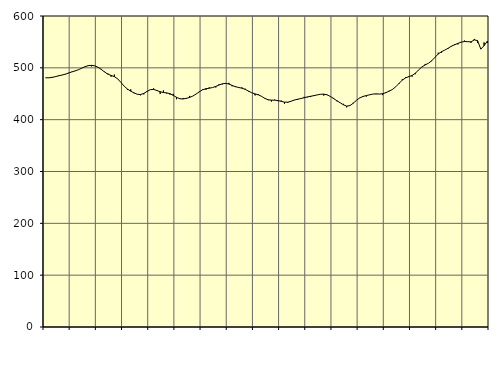
| Category | Piggar | Series 1 |
|---|---|---|
| nan | 480.3 | 480.8 |
| 87.0 | 480.5 | 480.75 |
| 87.0 | 482.5 | 481.49 |
| 87.0 | 482.3 | 483.02 |
| nan | 485.6 | 484.6 |
| 88.0 | 485.9 | 486.1 |
| 88.0 | 487.1 | 487.77 |
| 88.0 | 490.5 | 489.87 |
| nan | 492.6 | 492.14 |
| 89.0 | 493.8 | 494.07 |
| 89.0 | 496.4 | 496.28 |
| 89.0 | 499 | 499.15 |
| nan | 502.5 | 502.1 |
| 90.0 | 503.6 | 504.16 |
| 90.0 | 502.8 | 504.78 |
| 90.0 | 504.2 | 503.87 |
| nan | 501.3 | 501.18 |
| 91.0 | 497.9 | 496.98 |
| 91.0 | 492.7 | 492.05 |
| 91.0 | 489.1 | 487.88 |
| nan | 482.9 | 485.37 |
| 92.0 | 486.9 | 483.03 |
| 92.0 | 478.5 | 478.78 |
| 92.0 | 472 | 471.93 |
| nan | 464.7 | 464.64 |
| 93.0 | 457.4 | 459.09 |
| 93.0 | 458.4 | 455 |
| 93.0 | 451 | 451.74 |
| nan | 449.1 | 449.03 |
| 94.0 | 447 | 448.38 |
| 94.0 | 448.8 | 450.68 |
| 94.0 | 455.3 | 454.5 |
| nan | 457.6 | 457.9 |
| 95.0 | 460.3 | 458.4 |
| 95.0 | 457 | 456.24 |
| 95.0 | 449.7 | 453.9 |
| nan | 456.4 | 452.33 |
| 96.0 | 450.5 | 451.67 |
| 96.0 | 448.2 | 450.16 |
| 96.0 | 449.8 | 446.8 |
| nan | 439.4 | 443.11 |
| 97.0 | 441.3 | 440.37 |
| 97.0 | 441.7 | 439.96 |
| 97.0 | 440.1 | 441.18 |
| nan | 445.8 | 442.87 |
| 98.0 | 445.6 | 445.59 |
| 98.0 | 449.7 | 449.51 |
| 98.0 | 455.1 | 453.93 |
| nan | 458.7 | 457.76 |
| 99.0 | 457.6 | 459.71 |
| 99.0 | 462.3 | 460.67 |
| 99.0 | 462 | 461.98 |
| nan | 462.1 | 464.2 |
| 0.0 | 468.2 | 466.81 |
| 0.0 | 468 | 469.2 |
| 0.0 | 469.1 | 470.01 |
| nan | 471 | 468.73 |
| 1.0 | 464.3 | 466.13 |
| 1.0 | 464.6 | 463.54 |
| 1.0 | 462.7 | 462.09 |
| nan | 462.2 | 460.71 |
| 2.0 | 459.7 | 458.42 |
| 2.0 | 454.4 | 455.12 |
| 2.0 | 451.9 | 451.87 |
| nan | 446.8 | 449.71 |
| 3.0 | 449.2 | 447.92 |
| 3.0 | 445.3 | 444.98 |
| 3.0 | 440.4 | 441.01 |
| nan | 437.6 | 438.41 |
| 4.0 | 435 | 437.69 |
| 4.0 | 438.6 | 437.55 |
| 4.0 | 435.7 | 436.87 |
| nan | 436.8 | 435.29 |
| 5.0 | 430.8 | 433.82 |
| 5.0 | 432.7 | 433.72 |
| 5.0 | 435.3 | 435.51 |
| nan | 438.2 | 437.81 |
| 6.0 | 438.1 | 439.36 |
| 6.0 | 440.4 | 440.75 |
| 6.0 | 444 | 442.36 |
| nan | 443 | 443.87 |
| 7.0 | 443.6 | 445.15 |
| 7.0 | 445.8 | 446.34 |
| 7.0 | 447.6 | 447.76 |
| nan | 449.2 | 448.97 |
| 8.0 | 446.5 | 449.27 |
| 8.0 | 447.5 | 448.02 |
| 8.0 | 444.5 | 444.87 |
| nan | 442 | 440.78 |
| 9.0 | 435.5 | 436.61 |
| 9.0 | 432.6 | 432.68 |
| 9.0 | 430.5 | 428.74 |
| nan | 423.8 | 426.16 |
| 10.0 | 426.7 | 427.13 |
| 10.0 | 432.5 | 431.69 |
| 10.0 | 437.6 | 437.37 |
| nan | 442.3 | 441.95 |
| 11.0 | 445.6 | 444.8 |
| 11.0 | 444.6 | 446.51 |
| 11.0 | 448.2 | 447.89 |
| nan | 449.4 | 449.35 |
| 12.0 | 449.1 | 449.78 |
| 12.0 | 449.3 | 449.42 |
| 12.0 | 447.4 | 450.03 |
| nan | 453.1 | 452.1 |
| 13.0 | 455.9 | 455.04 |
| 13.0 | 457.9 | 458.33 |
| 13.0 | 463.3 | 463.39 |
| nan | 469 | 470.01 |
| 14.0 | 477.9 | 476.19 |
| 14.0 | 482.1 | 480.63 |
| 14.0 | 484.1 | 482.96 |
| nan | 483 | 485.28 |
| 15.0 | 487.8 | 489.67 |
| 15.0 | 496.2 | 496.02 |
| 15.0 | 501.8 | 501.79 |
| nan | 507.5 | 505.64 |
| 16.0 | 508.9 | 508.82 |
| 16.0 | 512.9 | 513.66 |
| 16.0 | 520.6 | 520.3 |
| nan | 529.2 | 526.8 |
| 17.0 | 529.3 | 531.23 |
| 17.0 | 534.2 | 534.21 |
| 17.0 | 536.8 | 537.78 |
| nan | 541.1 | 541.74 |
| 18.0 | 545.8 | 544.59 |
| 18.0 | 545.2 | 547.11 |
| 18.0 | 549.4 | 549.61 |
| nan | 552.6 | 550.73 |
| 19.0 | 550.9 | 550.47 |
| 19.0 | 548.4 | 550.09 |
| 19.0 | 555.7 | 553.87 |
| nan | 548 | 552.53 |
| 20.0 | 537.9 | 536.13 |
| 20.0 | 549 | 542.78 |
| 20.0 | 548 | 551.47 |